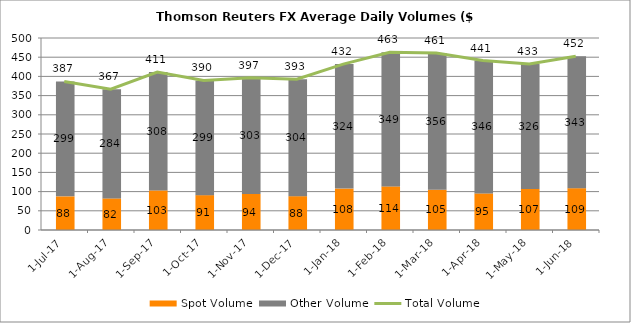
| Category | Spot Volume | Other Volume |
|---|---|---|
| 2018-06-01 | 108.9 | 343.4 |
| 2018-05-01 | 106.8 | 325.7 |
| 2018-04-01 | 95.3 | 345.9 |
| 2018-03-01 | 104.8 | 356.2 |
| 2018-02-01 | 113.6 | 349.1 |
| 2018-01-01 | 107.9 | 324.2 |
| 2017-12-01 | 88.1 | 304.4 |
| 2017-11-01 | 93.7 | 303.1 |
| 2017-10-01 | 90.8 | 298.7 |
| 2017-09-01 | 103.1 | 308.2 |
| 2017-08-01 | 82.3 | 284.3 |
| 2017-07-01 | 87.6 | 299.2 |